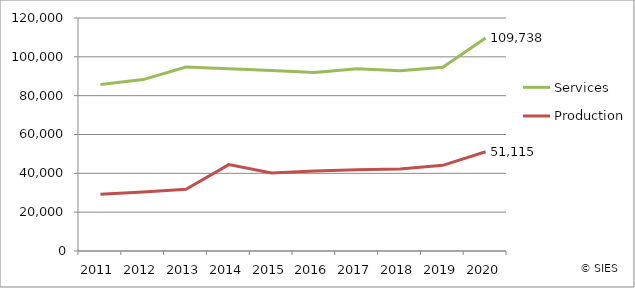
| Category | Services | Production |
|---|---|---|
| 2011.0 | 85729 | 29185 |
| 2012.0 | 88282 | 30347 |
| 2013.0 | 94703 | 31770 |
| 2014.0 | 93800 | 44472 |
| 2015.0 | 92959 | 40184 |
| 2016.0 | 91936 | 41208 |
| 2017.0 | 93849 | 41895 |
| 2018.0 | 92822 | 42268 |
| 2019.0 | 94579 | 44103 |
| 2020.0 | 109738 | 51115 |